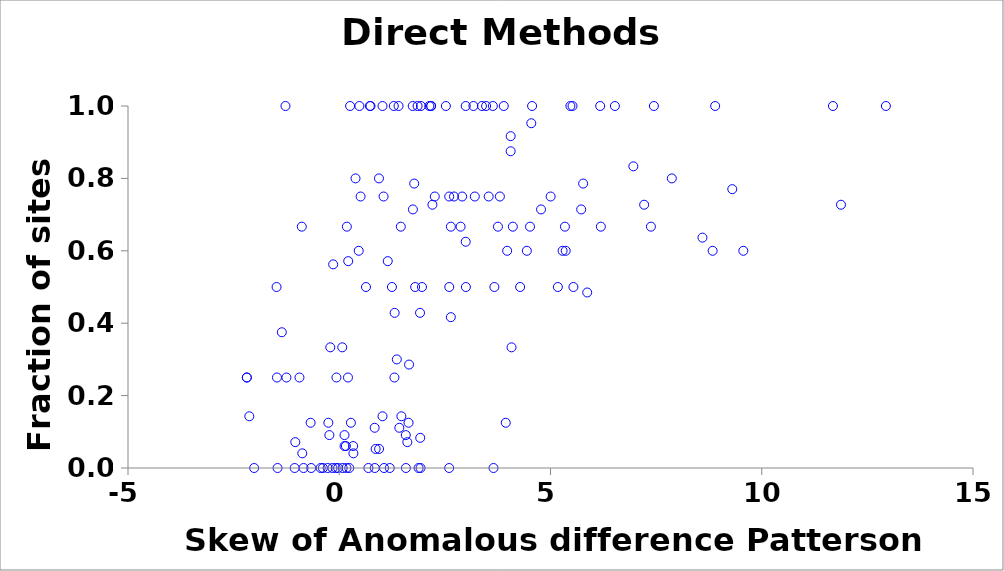
| Category | LLGC |
|---|---|
| -1.055542419801308 | 0 |
| -1.272605693056573 | 1 |
| -0.439760628069408 | 0 |
| 1.877478260859497 | 0 |
| 0.740183592090503 | 1 |
| 1.854065198422105 | 1 |
| 2.993607055042462 | 1 |
| -1.459973109341402 | 0 |
| 5.341159467756041 | 0.667 |
| 4.077829383385234 | 0.333 |
| 6.192148473672122 | 0.667 |
| 0.690091124417638 | 0 |
| -0.212154283482564 | 0.333 |
| -0.664432276458632 | 0 |
| 0.256660300786857 | 1 |
| -0.886833016976702 | 0.667 |
| 2.641890232390437 | 0.667 |
| 0.723461180713934 | 1 |
| 4.515676819702667 | 0.667 |
| 6.175994591966545 | 1 |
| 0.180181158837432 | 0.667 |
| 2.872324577759275 | 0.667 |
| 4.108874572191271 | 0.667 |
| -0.941740410091868 | 0.25 |
| 0.236518751899294 | 0 |
| -1.47420854020047 | 0.25 |
| 1.305967365595327 | 0.25 |
| 3.650834304648733 | 0 |
| 4.28121028448732 | 0.5 |
| 5.542393436052694 | 0.5 |
| 3.67206100167195 | 0.5 |
| -1.483559179810499 | 0.5 |
| 1.796423135010235 | 0.5 |
| -2.014639977762776 | 0 |
| 0.505394994039316 | 0.75 |
| 3.475584640028207 | 1 |
| 1.023909859313797 | 1 |
| 1.049390222939017 | 0.75 |
| 0.206368602263038 | 0.25 |
| 2.523747213965772 | 1 |
| 0.632676094063937 | 0.5 |
| 5.47080743583614 | 1 |
| 2.602319457714598 | 0.75 |
| 3.893739631767897 | 1 |
| 1.738594527197184 | 1 |
| 1.291336226549848 | 1 |
| 3.37708349171293 | 1 |
| 1.403355977647867 | 1 |
| 2.261315793957137 | 0.75 |
| -0.844704540061198 | 0 |
| 5.286227175405915 | 0.6 |
| 5.36017640008237 | 0.6 |
| 1.195725721058136 | 0 |
| 3.973994918215171 | 0.6 |
| 0.46099787418165 | 0.6 |
| 0.385131665797555 | 0.8 |
| 0.477168649431205 | 1 |
| 0.940069279361899 | 0.8 |
| 0.170359061983799 | 0 |
| 1.92451519609485 | 0 |
| 8.837912295898844 | 0.6 |
| 3.635494964925684 | 1 |
| 11.68506997540023 | 1 |
| 8.897305803444096 | 1 |
| 2.175556236919653 | 1 |
| 3.175639576526279 | 1 |
| 1.933569052296814 | 1 |
| 5.521363237462284 | 1 |
| 4.564088764474241 | 1 |
| 6.524534300622537 | 1 |
| 17.83179483394759 | 1 |
| 21.43633376862751 | 1 |
| 21.43633376862751 | 1 |
| 12.93878028447813 | 1 |
| 17.6497509087239 | 1 |
| 1.47071177665782 | 0.143 |
| 0.21213681905789 | 0.571 |
| 1.024274909387123 | 0.143 |
| 1.148189113343268 | 0.571 |
| 1.652056418528132 | 0.286 |
| 1.911904657664707 | 0.429 |
| -0.67749373428837 | 0.125 |
| 0.27537973781671 | 0.125 |
| -2.187670258517036 | 0.25 |
| -0.0665945943752194 | 0.25 |
| -2.187670258517036 | 0.25 |
| -1.249691161847598 | 0.25 |
| 7.447433235685971 | 1 |
| 2.600990419051942 | 0 |
| 1.059505205272725 | 0 |
| 2.997387235577012 | 0.5 |
| -0.258153830109104 | 0.125 |
| -1.359073375502588 | 0.375 |
| 0.840468619283314 | 0 |
| -0.274285690476189 | 0 |
| 2.171698487359606 | 1 |
| -0.160486261094213 | 0 |
| 2.604132853753817 | 0.5 |
| 1.577787019847736 | 0 |
| 1.640209937782356 | 0.125 |
| 0.0809177360039194 | 0 |
| 4.057050928938408 | 0.875 |
| 2.13289594917333 | 1 |
| -0.0270495841003147 | 0 |
| 5.003510587577486 | 0.75 |
| -0.0830614230554714 | 0 |
| 3.756336987012747 | 0.667 |
| 1.457328487335645 | 0.667 |
| 7.377096672811058 | 0.667 |
| 1.362535504124571 | 0.3 |
| -0.387452732601023 | 0 |
| 1.958107790699991 | 0.5 |
| 4.44013007241905 | 0.6 |
| 1.247076581449592 | 0.5 |
| 9.563414608287147 | 0.6 |
| 7.87159983739011 | 0.8 |
| 5.173961293825071 | 0.5 |
| 0.124725498595917 | 0.091 |
| 1.574936532054546 | 0.091 |
| 2.20505701513589 | 0.727 |
| 8.59640228933011 | 0.636 |
| 11.87501034610075 | 0.727 |
| 4.057329229924533 | 0.917 |
| 3.537032234797981 | 0.75 |
| 2.715825150851947 | 0.75 |
| 1.916448757467833 | 0.083 |
| 2.641075417325299 | 0.417 |
| 3.208745628746535 | 0.75 |
| 2.909226701376158 | 0.75 |
| -2.128414057461564 | 0.143 |
| 1.610952513266608 | 0.071 |
| -1.040499706871655 | 0.071 |
| 1.31104076214281 | 0.429 |
| 1.773749841437625 | 0.786 |
| 5.72609599989382 | 0.714 |
| 5.772713291858517 | 0.786 |
| 1.743424125105535 | 0.714 |
| 23.60616539444727 | 0.786 |
| 41.70135139297046 | 0.786 |
| 34.55984902310772 | 0.786 |
| 2.993236108294833 | 0.625 |
| 3.940937715823482 | 0.125 |
| -0.144179887640406 | 0.562 |
| 3.802272162799502 | 0.75 |
| 6.960831700307083 | 0.833 |
| 40.34180921277577 | 0.833 |
| 4.776251450667144 | 0.714 |
| 4.545195949571371 | 0.952 |
| -0.233994187962009 | 0.091 |
| 7.216585952512448 | 0.727 |
| 0.83815518849435 | 0.111 |
| 0.0707371896529682 | 0.333 |
| 1.42174022943715 | 0.111 |
| 0.32903723193584 | 0.061 |
| 0.125610190669388 | 0.061 |
| 5.868786863568995 | 0.485 |
| 0.942576129551348 | 0.053 |
| 0.861489117749029 | 0.053 |
| 0.157923145865323 | 0.061 |
| 0.335182040091649 | 0.041 |
| -0.87521389385681 | 0.041 |
| 9.30209451682791 | 0.77 |